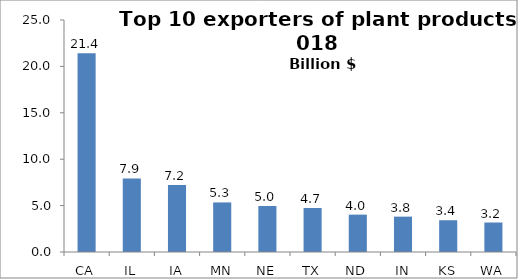
| Category | Series 0 |
|---|---|
| CA | 21.429 |
| IL | 7.923 |
| IA | 7.223 |
| MN | 5.342 |
| NE | 4.954 |
| TX | 4.74 |
| ND | 4.026 |
| IN | 3.811 |
| KS | 3.422 |
| WA | 3.178 |